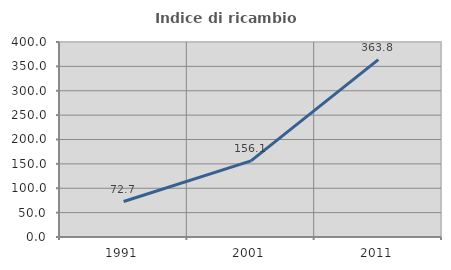
| Category | Indice di ricambio occupazionale  |
|---|---|
| 1991.0 | 72.739 |
| 2001.0 | 156.106 |
| 2011.0 | 363.758 |